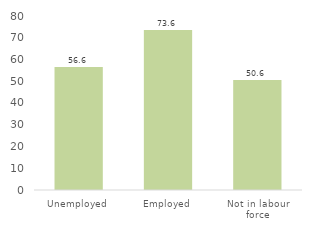
| Category | Series 0 |
|---|---|
| Unemployed | 56.551 |
| Employed | 73.607 |
| Not in labour force | 50.601 |